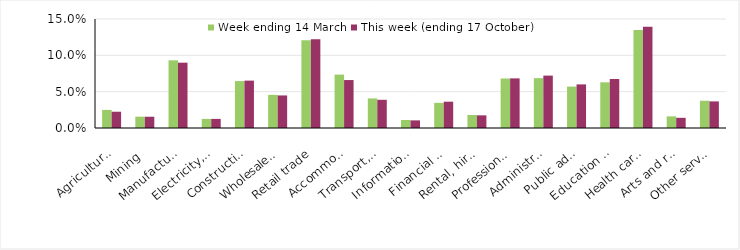
| Category | Week ending 14 March | This week (ending 17 October) |
|---|---|---|
| Agriculture, forestry and fishing | 0.025 | 0.022 |
| Mining | 0.016 | 0.016 |
| Manufacturing | 0.093 | 0.09 |
| Electricity, gas, water and waste services | 0.012 | 0.012 |
| Construction | 0.065 | 0.065 |
| Wholesale trade | 0.046 | 0.045 |
| Retail trade | 0.121 | 0.122 |
| Accommodation and food services | 0.074 | 0.066 |
| Transport, postal and warehousing | 0.041 | 0.039 |
| Information media and telecommunications | 0.011 | 0.01 |
| Financial and insurance services | 0.035 | 0.036 |
| Rental, hiring and real estate services | 0.018 | 0.017 |
| Professional, scientific and technical services | 0.068 | 0.068 |
| Administrative and support services | 0.069 | 0.072 |
| Public administration and safety | 0.057 | 0.06 |
| Education and training | 0.063 | 0.067 |
| Health care and social assistance | 0.135 | 0.14 |
| Arts and recreation services | 0.016 | 0.014 |
| Other services | 0.038 | 0.037 |